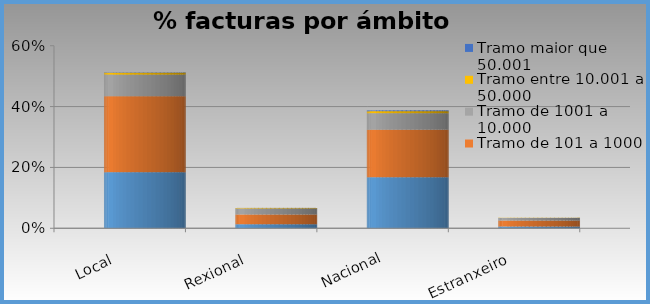
| Category | Tramo  de 0 a 100 € | Tramo de 101 a 1000 | Tramo de 1001 a 10.000 | Tramo entre 10.001 a 50.000 | Tramo maior que 50.001 |
|---|---|---|---|---|---|
| Local | 0.184 | 0.25 | 0.071 | 0.006 | 0.001 |
| Rexional | 0.013 | 0.032 | 0.02 | 0.001 | 0 |
| Nacional | 0.168 | 0.156 | 0.054 | 0.007 | 0.002 |
| Estranxeiro | 0.006 | 0.019 | 0.009 | 0 | 0 |